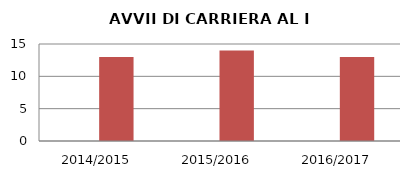
| Category | ANNO | NUMERO |
|---|---|---|
| 2014/2015 | 0 | 13 |
| 2015/2016 | 0 | 14 |
| 2016/2017 | 0 | 13 |